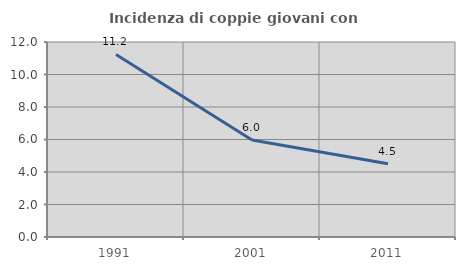
| Category | Incidenza di coppie giovani con figli |
|---|---|
| 1991.0 | 11.236 |
| 2001.0 | 5.964 |
| 2011.0 | 4.511 |